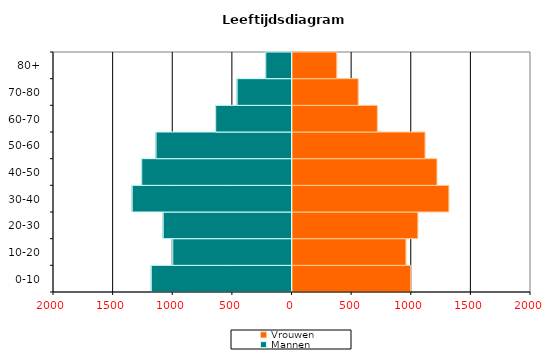
| Category | Vrouwen | Mannen |
|---|---|---|
| 0-10 | 1000 | -1180 |
| 10-20 | 960 | -1000 |
| 20-30 | 1060 | -1080 |
| 30-40 | 1320 | -1340 |
| 40-50 | 1220 | -1260 |
| 50-60 | 1120 | -1140 |
| 60-70 | 720 | -640 |
| 70-80 | 560 | -460 |
| 80+ | 380 | -220 |